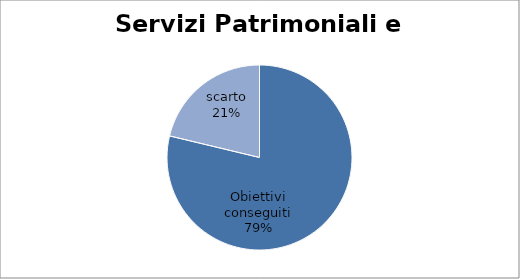
| Category | Series 0 |
|---|---|
| Obiettivi conseguiti | 78.75 |
| scarto | 21.25 |